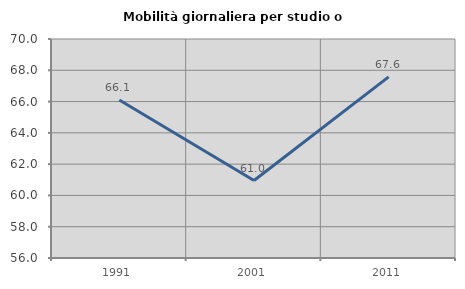
| Category | Mobilità giornaliera per studio o lavoro |
|---|---|
| 1991.0 | 66.102 |
| 2001.0 | 60.954 |
| 2011.0 | 67.58 |